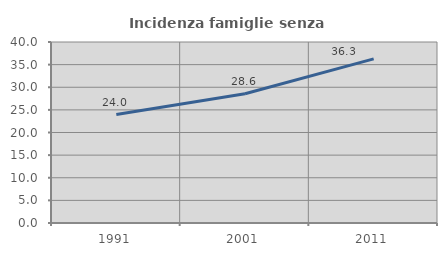
| Category | Incidenza famiglie senza nuclei |
|---|---|
| 1991.0 | 23.957 |
| 2001.0 | 28.571 |
| 2011.0 | 36.263 |